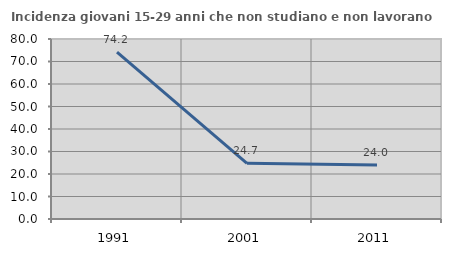
| Category | Incidenza giovani 15-29 anni che non studiano e non lavorano  |
|---|---|
| 1991.0 | 74.161 |
| 2001.0 | 24.739 |
| 2011.0 | 23.975 |